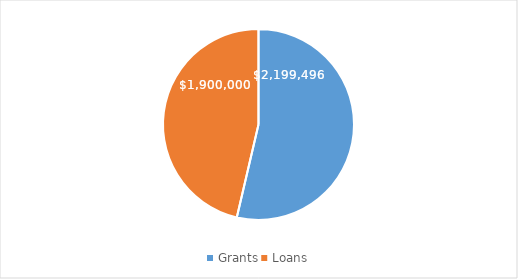
| Category | Series 0 |
|---|---|
| Grants | 2199495.5 |
| Loans | 1900000 |